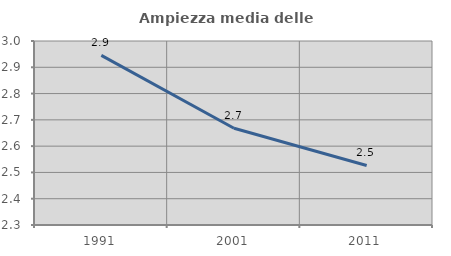
| Category | Ampiezza media delle famiglie |
|---|---|
| 1991.0 | 2.945 |
| 2001.0 | 2.668 |
| 2011.0 | 2.526 |